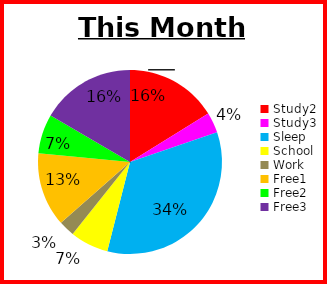
| Category | 108:40:00 |
|---|---|
| Study2 | 1900-01-04 12:40:00 |
| Study3 | 1900-01-01 00:15:00 |
| Sleep | 1900-01-09 13:50:00 |
| School | 1900-01-01 21:15:00 |
| Work | 0.785 |
| Free1 | 1900-01-03 15:20:00 |
| Free2 | 1900-01-01 22:25:00 |
| Free3 | 1900-01-04 15:25:00 |